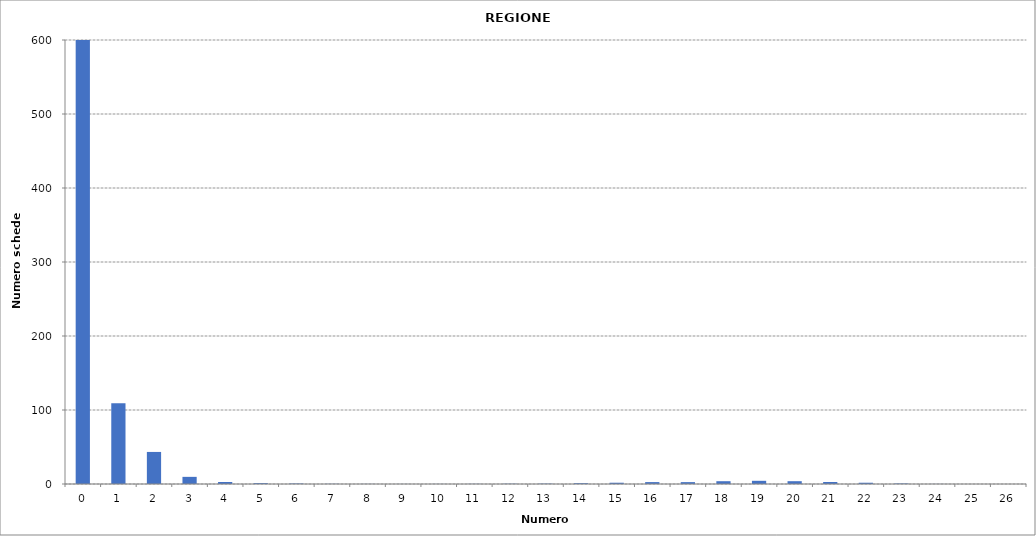
| Category | Series 0 |
|---|---|
| 0.0 | 607455 |
| 1.0 | 109105 |
| 2.0 | 43323 |
| 3.0 | 9649 |
| 4.0 | 2711 |
| 5.0 | 1182 |
| 6.0 | 642 |
| 7.0 | 225 |
| 8.0 | 137 |
| 9.0 | 77 |
| 10.0 | 96 |
| 11.0 | 175 |
| 12.0 | 350 |
| 13.0 | 462 |
| 14.0 | 1096 |
| 15.0 | 1719 |
| 16.0 | 2581 |
| 17.0 | 2548 |
| 18.0 | 3767 |
| 19.0 | 4318 |
| 20.0 | 3787 |
| 21.0 | 2690 |
| 22.0 | 1715 |
| 23.0 | 689 |
| 24.0 | 107 |
| 25.0 | 5 |
| 26.0 | 2 |